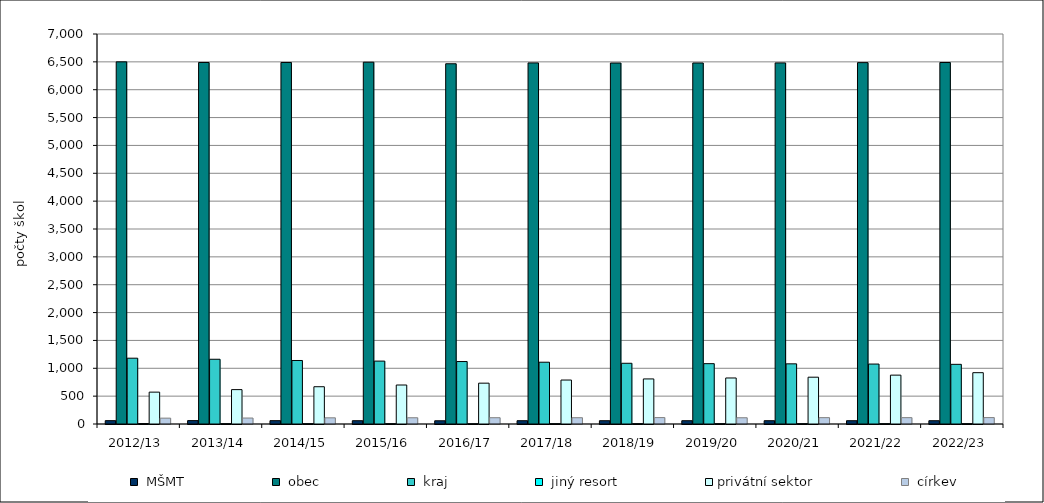
| Category |  MŠMT |  obec |  kraj |  jiný resort | privátní sektor |  církev |
|---|---|---|---|---|---|---|
| 2012/13 | 60 | 6500 | 1181 | 8 | 572 | 105 |
| 2013/14 | 61 | 6489 | 1162 | 6 | 617 | 107 |
| 2014/15 | 60 | 6489 | 1140 | 6 | 669 | 111 |
| 2015/16 | 59 | 6494 | 1129 | 6 | 700 | 112 |
| 2016/17 | 58 | 6466 | 1121 | 5 | 733 | 113 |
| 2017/18 | 59 | 6481 | 1109 | 6 | 789 | 113 |
| 2018/19 | 59 | 6479 | 1090 | 6 | 809 | 115 |
| 2019/20 | 59 | 6480 | 1083 | 6 | 826 | 112 |
| 2020/21 | 59 | 6481 | 1080 | 6 | 840 | 114 |
| 2021/22 | 59 | 6486 | 1076 | 6 | 877 | 114 |
| 2022/23 | 59 | 6488 | 1071 | 6 | 921 | 115 |